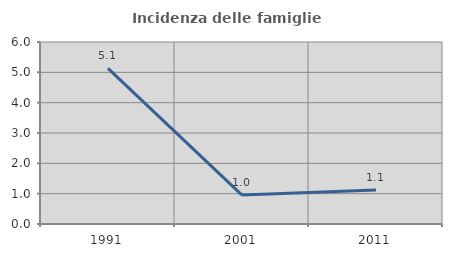
| Category | Incidenza delle famiglie numerose |
|---|---|
| 1991.0 | 5.128 |
| 2001.0 | 0.952 |
| 2011.0 | 1.124 |